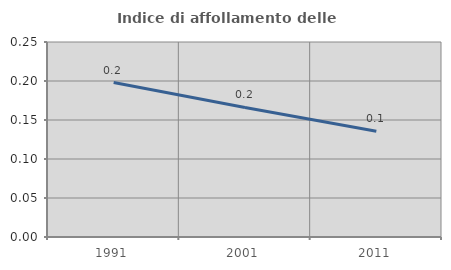
| Category | Indice di affollamento delle abitazioni  |
|---|---|
| 1991.0 | 0.198 |
| 2001.0 | 0.166 |
| 2011.0 | 0.136 |